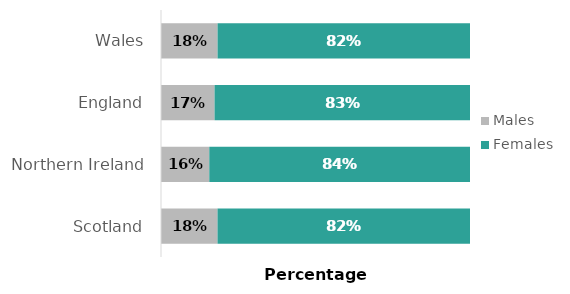
| Category | Males | Females |
|---|---|---|
| Scotland | 0.183 | 0.817 |
| Northern Ireland | 0.156 | 0.844 |
| England | 0.173 | 0.827 |
| Wales | 0.183 | 0.817 |